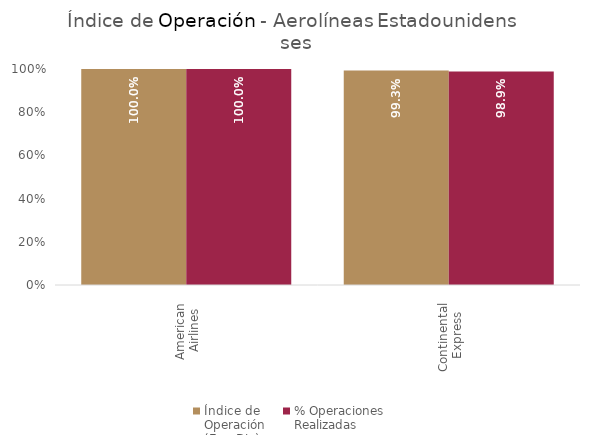
| Category | Índice de 
Operación
(Ene-Dic) | % Operaciones
Realizadas |
|---|---|---|
| American 
Airlines | 1 | 1 |
| Continental 
Express | 0.993 | 0.989 |